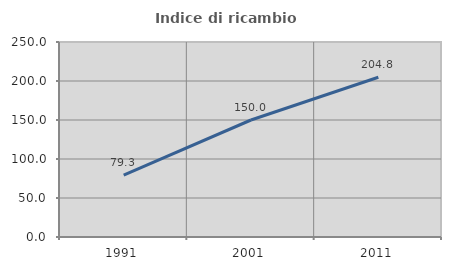
| Category | Indice di ricambio occupazionale  |
|---|---|
| 1991.0 | 79.268 |
| 2001.0 | 150 |
| 2011.0 | 204.762 |